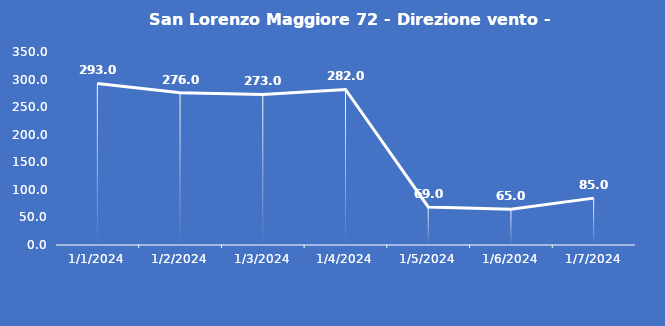
| Category | San Lorenzo Maggiore 72 - Direzione vento - Grezzo (°N) |
|---|---|
| 1/1/24 | 293 |
| 1/2/24 | 276 |
| 1/3/24 | 273 |
| 1/4/24 | 282 |
| 1/5/24 | 69 |
| 1/6/24 | 65 |
| 1/7/24 | 85 |